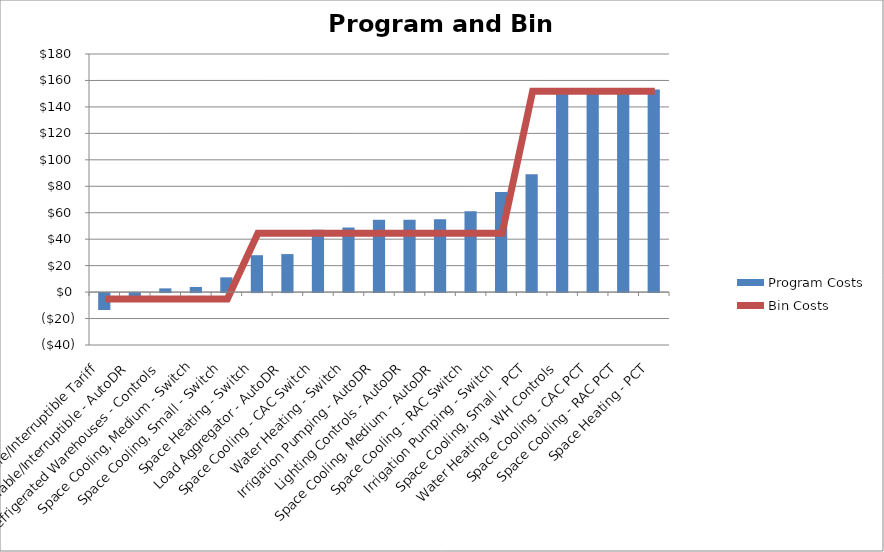
| Category | Program Costs |
|---|---|
|  Curtailable/Interruptible Tariff | -12.801 |
|  Curtailable/Interruptible - AutoDR | -2.896 |
|  Refrigerated Warehouses - Controls | 2.816 |
|  Space Cooling, Medium - Switch | 3.879 |
|  Space Cooling, Small - Switch | 11.147 |
|  Space Heating - Switch | 27.889 |
|  Load Aggregator - AutoDR | 28.723 |
|  Space Cooling - CAC Switch | 47.063 |
|  Water Heating - Switch | 48.858 |
|  Irrigation Pumping - AutoDR | 54.738 |
|  Lighting Controls - AutoDR | 54.738 |
|  Space Cooling, Medium - AutoDR | 55.125 |
|  Space Cooling - RAC Switch | 61.154 |
|  Irrigation Pumping - Switch | 75.656 |
|  Space Cooling, Small - PCT | 89.046 |
|  Water Heating - WH Controls | 152.098 |
|  Space Cooling - CAC PCT | 153.085 |
|  Space Cooling - RAC PCT | 153.085 |
|  Space Heating - PCT | 153.085 |